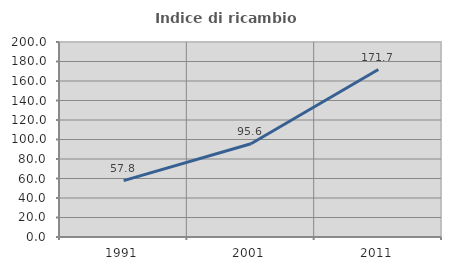
| Category | Indice di ricambio occupazionale  |
|---|---|
| 1991.0 | 57.831 |
| 2001.0 | 95.584 |
| 2011.0 | 171.714 |